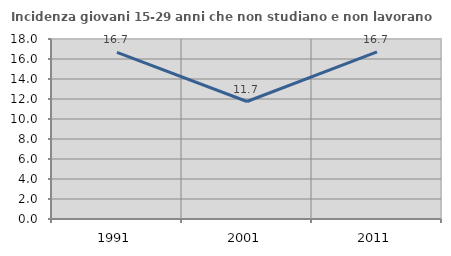
| Category | Incidenza giovani 15-29 anni che non studiano e non lavorano  |
|---|---|
| 1991.0 | 16.667 |
| 2001.0 | 11.749 |
| 2011.0 | 16.713 |